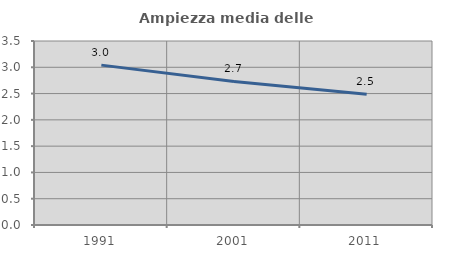
| Category | Ampiezza media delle famiglie |
|---|---|
| 1991.0 | 3.041 |
| 2001.0 | 2.73 |
| 2011.0 | 2.488 |